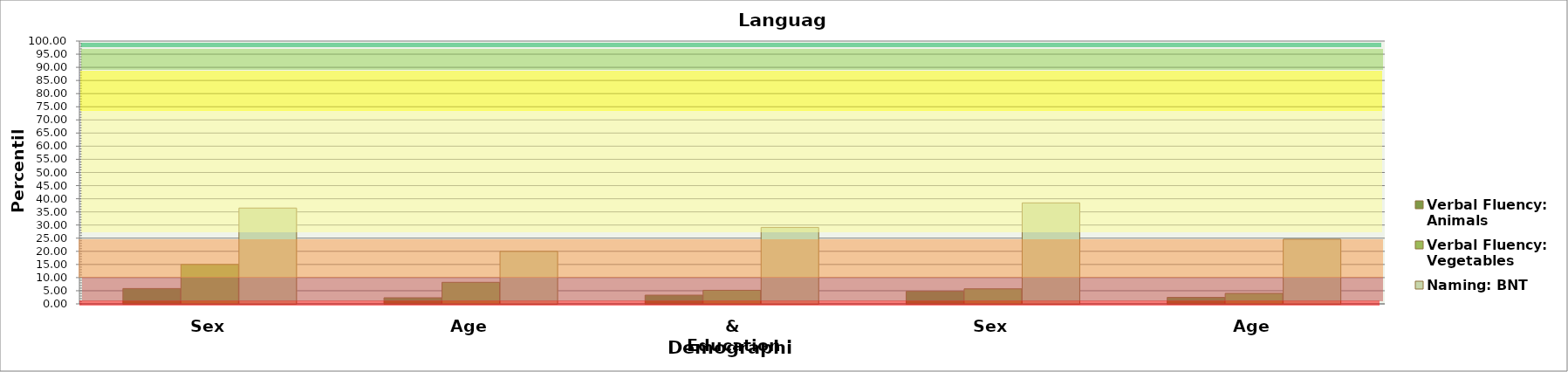
| Category | Verbal Fluency: Animals | Verbal Fluency: Vegetables | Naming: BNT |
|---|---|---|---|
| 0 | 5.848 | 14.994 | 36.462 |
| 1 | 2.333 | 8.204 | 19.964 |
| 2 | 3.318 | 5.171 | 29.092 |
| 3 | 4.774 | 5.729 | 38.433 |
| 4 | 2.475 | 4.006 | 24.588 |